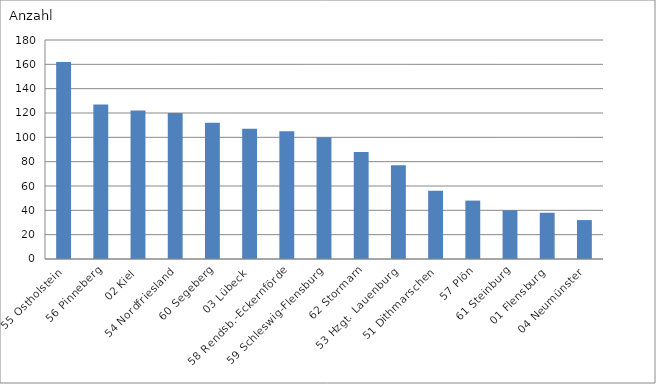
| Category | 55 Ostholstein |
|---|---|
| 55 Ostholstein | 162 |
| 56 Pinneberg | 127 |
| 02 Kiel | 122 |
| 54 Nordfriesland | 120 |
| 60 Segeberg | 112 |
| 03 Lübeck | 107 |
| 58 Rendsb.-Eckernförde | 105 |
| 59 Schleswig-Flensburg | 100 |
| 62 Stormarn | 88 |
| 53 Hzgt. Lauenburg | 77 |
| 51 Dithmarschen | 56 |
| 57 Plön | 48 |
| 61 Steinburg | 40 |
| 01 Flensburg | 38 |
| 04 Neumünster | 32 |